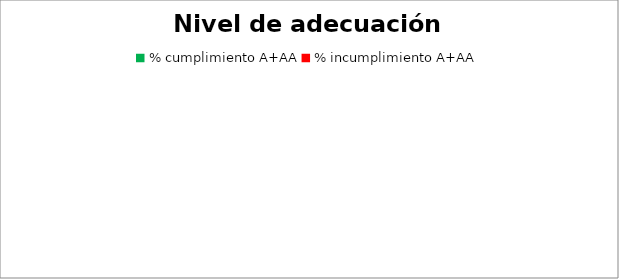
| Category | Series 0 |
|---|---|
| % cumplimiento A+AA | 0 |
| % incumplimiento A+AA | 0 |